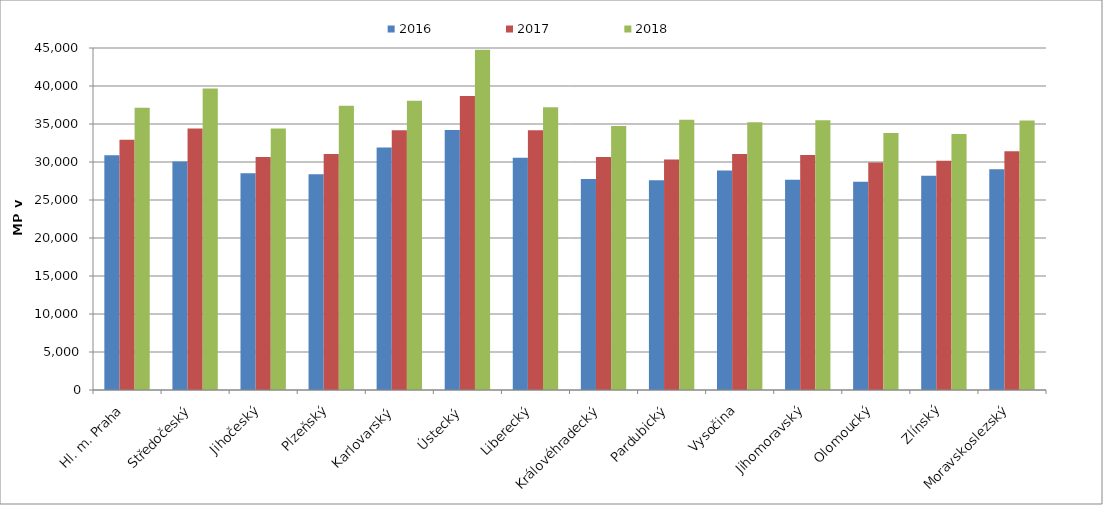
| Category | 2016 | 2017 | 2018 |
|---|---|---|---|
| Hl. m. Praha | 30874.997 | 32919.015 | 37134.794 |
| Středočeský | 30068.637 | 34404.675 | 39686.818 |
| Jihočeský | 28505.301 | 30641.721 | 34394.43 |
| Plzeňský | 28388.842 | 31037.55 | 37392.746 |
| Karlovarský  | 31914.322 | 34166.021 | 38057.071 |
| Ústecký   | 34216.98 | 38698.261 | 44753.928 |
| Liberecký | 30562.566 | 34185.996 | 37202.419 |
| Královéhradecký | 27755.535 | 30654.581 | 34733.972 |
| Pardubický | 27605.231 | 30318.112 | 35550.784 |
| Vysočina | 28869.156 | 31047.771 | 35242.878 |
| Jihomoravský | 27654.6 | 30921.908 | 35501.305 |
| Olomoucký | 27412.923 | 29927.016 | 33815.846 |
| Zlínský | 28191.048 | 30158.295 | 33679.778 |
| Moravskoslezský | 29059.144 | 31425.86 | 35472.492 |